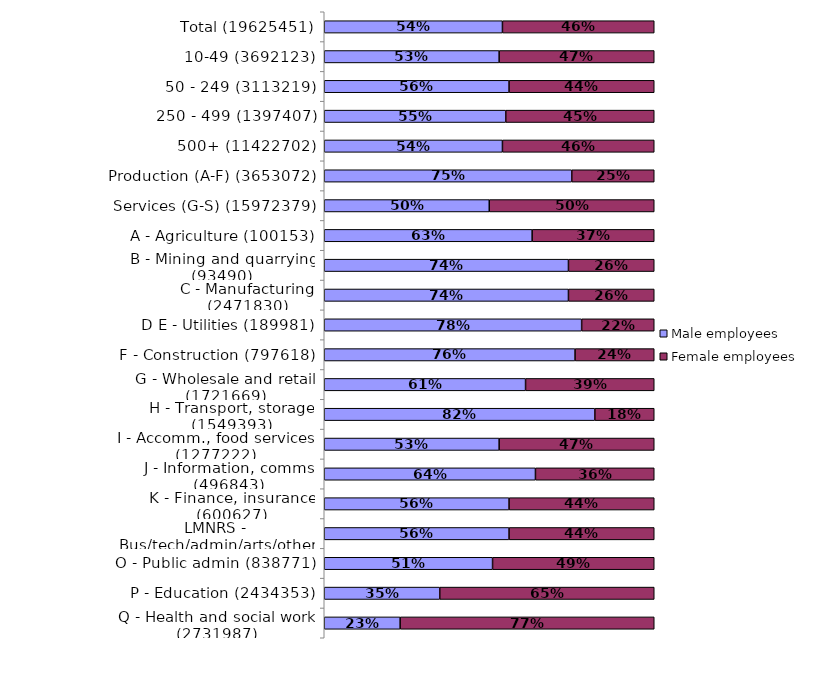
| Category | Male employees | Female employees |
|---|---|---|
| Total (19625451) | 0.54 | 0.46 |
| 10-49 (3692123) | 0.53 | 0.47 |
| 50 - 249 (3113219) | 0.56 | 0.44 |
| 250 - 499 (1397407) | 0.55 | 0.45 |
| 500+ (11422702) | 0.54 | 0.46 |
| Production (A-F) (3653072) | 0.75 | 0.25 |
| Services (G-S) (15972379) | 0.5 | 0.5 |
| A - Agriculture (100153) | 0.63 | 0.37 |
| B - Mining and quarrying (93490) | 0.74 | 0.26 |
| C - Manufacturing (2471830) | 0.74 | 0.26 |
| D E - Utilities (189981) | 0.78 | 0.22 |
| F - Construction (797618) | 0.76 | 0.24 |
| G - Wholesale and retail (1721669) | 0.61 | 0.39 |
| H - Transport, storage (1549393) | 0.82 | 0.18 |
| I - Accomm., food services (1277222) | 0.53 | 0.47 |
| J - Information, comms (496843) | 0.64 | 0.36 |
| K - Finance, insurance (600627) | 0.56 | 0.44 |
| LMNRS - Bus/tech/admin/arts/other (4321513) | 0.56 | 0.44 |
| O - Public admin (838771) | 0.51 | 0.49 |
| P - Education (2434353) | 0.35 | 0.65 |
| Q - Health and social work (2731987) | 0.23 | 0.77 |